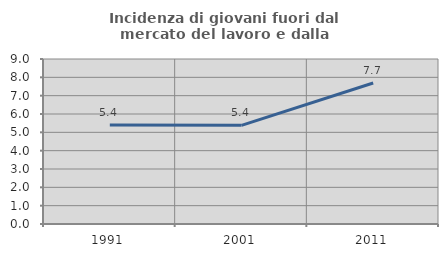
| Category | Incidenza di giovani fuori dal mercato del lavoro e dalla formazione  |
|---|---|
| 1991.0 | 5.405 |
| 2001.0 | 5.381 |
| 2011.0 | 7.692 |